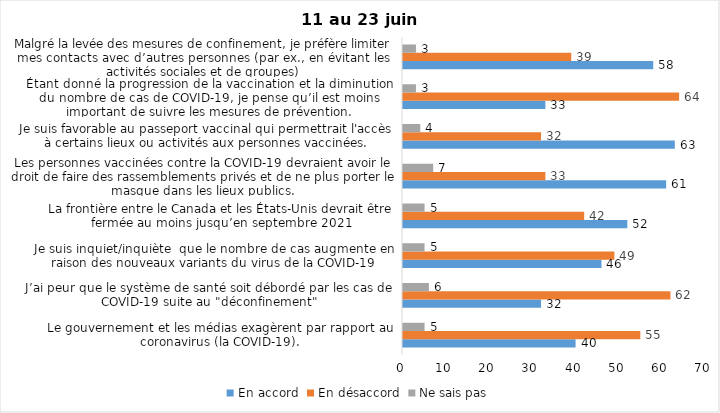
| Category | En accord | En désaccord | Ne sais pas |
|---|---|---|---|
| Le gouvernement et les médias exagèrent par rapport au coronavirus (la COVID-19). | 40 | 55 | 5 |
| J’ai peur que le système de santé soit débordé par les cas de COVID-19 suite au "déconfinement" | 32 | 62 | 6 |
| Je suis inquiet/inquiète  que le nombre de cas augmente en raison des nouveaux variants du virus de la COVID-19 | 46 | 49 | 5 |
| La frontière entre le Canada et les États-Unis devrait être fermée au moins jusqu’en septembre 2021 | 52 | 42 | 5 |
| Les personnes vaccinées contre la COVID-19 devraient avoir le droit de faire des rassemblements privés et de ne plus porter le masque dans les lieux publics. | 61 | 33 | 7 |
| Je suis favorable au passeport vaccinal qui permettrait l'accès à certains lieux ou activités aux personnes vaccinées. | 63 | 32 | 4 |
| Étant donné la progression de la vaccination et la diminution du nombre de cas de COVID-19, je pense qu’il est moins important de suivre les mesures de prévention. | 33 | 64 | 3 |
| Malgré la levée des mesures de confinement, je préfère limiter mes contacts avec d’autres personnes (par ex., en évitant les activités sociales et de groupes) | 58 | 39 | 3 |